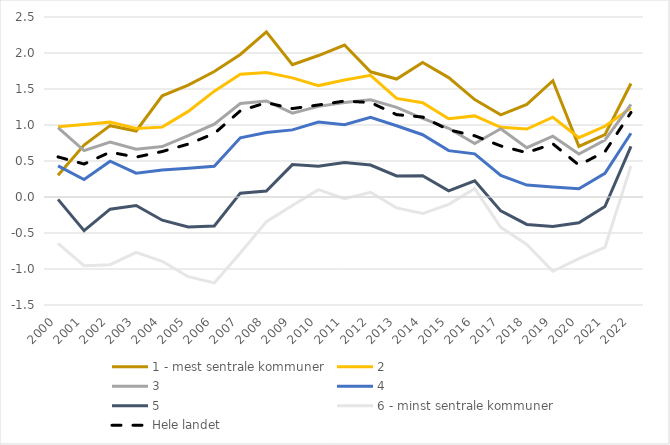
| Category | 1 - mest sentrale kommuner | 2 | 3 | 4 | 5 | 6 - minst sentrale kommuner | Hele landet |
|---|---|---|---|---|---|---|---|
| 2000.0 | 0.302 | 0.976 | 0.963 | 0.432 | -0.033 | -0.644 | 0.557 |
| 2001.0 | 0.72 | 1.006 | 0.645 | 0.242 | -0.468 | -0.954 | 0.458 |
| 2002.0 | 0.991 | 1.04 | 0.764 | 0.497 | -0.169 | -0.939 | 0.623 |
| 2003.0 | 0.917 | 0.953 | 0.664 | 0.331 | -0.117 | -0.768 | 0.554 |
| 2004.0 | 1.406 | 0.97 | 0.701 | 0.374 | -0.322 | -0.893 | 0.631 |
| 2005.0 | 1.554 | 1.189 | 0.854 | 0.401 | -0.416 | -1.107 | 0.735 |
| 2006.0 | 1.742 | 1.47 | 1.011 | 0.426 | -0.404 | -1.194 | 0.882 |
| 2007.0 | 1.98 | 1.704 | 1.299 | 0.823 | 0.053 | -0.779 | 1.197 |
| 2008.0 | 2.294 | 1.728 | 1.333 | 0.896 | 0.084 | -0.342 | 1.311 |
| 2009.0 | 1.838 | 1.654 | 1.165 | 0.932 | 0.45 | -0.119 | 1.228 |
| 2010.0 | 1.965 | 1.547 | 1.259 | 1.041 | 0.427 | 0.102 | 1.278 |
| 2011.0 | 2.111 | 1.625 | 1.312 | 1.003 | 0.48 | -0.024 | 1.333 |
| 2012.0 | 1.739 | 1.69 | 1.35 | 1.107 | 0.443 | 0.065 | 1.312 |
| 2013.0 | 1.639 | 1.369 | 1.244 | 0.99 | 0.292 | -0.151 | 1.144 |
| 2014.0 | 1.868 | 1.31 | 1.092 | 0.865 | 0.295 | -0.23 | 1.111 |
| 2015.0 | 1.658 | 1.088 | 0.955 | 0.644 | 0.086 | -0.103 | 0.933 |
| 2016.0 | 1.353 | 1.126 | 0.743 | 0.599 | 0.225 | 0.116 | 0.85 |
| 2017.0 | 1.142 | 0.967 | 0.948 | 0.299 | -0.193 | -0.421 | 0.709 |
| 2018.0 | 1.286 | 0.944 | 0.685 | 0.165 | -0.381 | -0.66 | 0.615 |
| 2019.0 | 1.615 | 1.108 | 0.844 | 0.138 | -0.411 | -1.031 | 0.739 |
| 2020.0 | 0.703 | 0.824 | 0.597 | 0.113 | -0.358 | -0.855 | 0.443 |
| 2021.0 | 0.866 | 0.982 | 0.792 | 0.328 | -0.132 | -0.701 | 0.629 |
| 2022.0 | 1.576 | 1.237 | 1.286 | 0.886 | 0.704 | 0.432 | 1.174 |